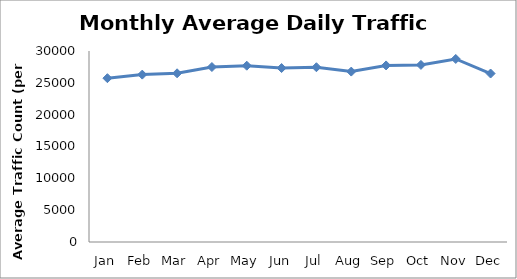
| Category | Series 0 |
|---|---|
| Jan | 25729.75 |
| Feb | 26291 |
| Mar | 26497 |
| Apr | 27483.25 |
| May | 27688.5 |
| Jun | 27324 |
| Jul | 27451.25 |
| Aug | 26766 |
| Sep | 27732.75 |
| Oct | 27815.5 |
| Nov | 28749 |
| Dec | 26462.25 |